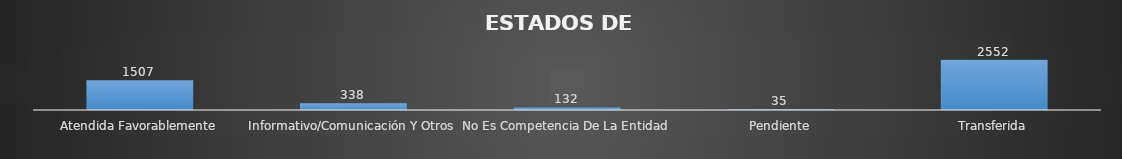
| Category | Series 0 |
|---|---|
| Atendida Favorablemente | 1507 |
| Informativo/Comunicación Y Otros | 338 |
| No Es Competencia De La Entidad | 132 |
| Pendiente | 35 |
| Transferida | 2552 |